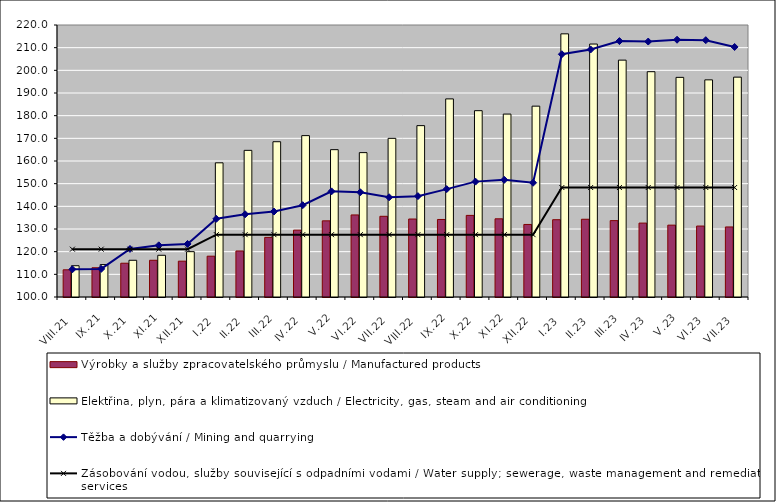
| Category | Výrobky a služby zpracovatelského průmyslu / Manufactured products | Elektřina, plyn, pára a klimatizovaný vzduch / Electricity, gas, steam and air conditioning |
|---|---|---|
| VIII.21 | 112 | 113.8 |
| IX.21 | 112.9 | 114.3 |
| X.21 | 114.9 | 116.2 |
| XI.21 | 116.2 | 118.4 |
| XII.21 | 115.8 | 120 |
| I.22 | 118 | 159.2 |
| II.22 | 120.3 | 164.7 |
| III.22 | 126.3 | 168.5 |
| IV.22 | 129.5 | 171.2 |
| V.22 | 133.6 | 165 |
| VI.22 | 136.2 | 163.7 |
| VII.22 | 135.6 | 170 |
| VIII.22 | 134.4 | 175.6 |
| IX.22 | 134.2 | 187.4 |
| X.22 | 136 | 182.2 |
| XI.22 | 134.5 | 180.7 |
| XII.22 | 132 | 184.2 |
| I.23 | 134.1 | 216.1 |
| II.23 | 134.3 | 211.6 |
| III.23 | 133.7 | 204.5 |
| IV.23 | 132.6 | 199.4 |
| V.23 | 131.7 | 196.9 |
| VI.23 | 131.3 | 195.8 |
| VII.23 | 130.9 | 197 |